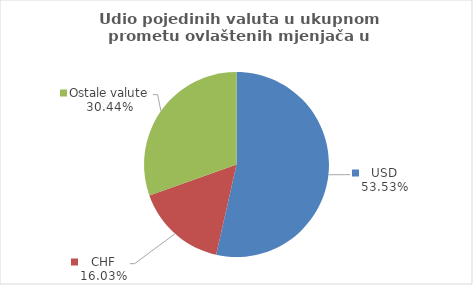
| Category | Series 0 |
|---|---|
| USD | 53.531 |
| CHF | 16.034 |
| Ostale valute | 30.435 |